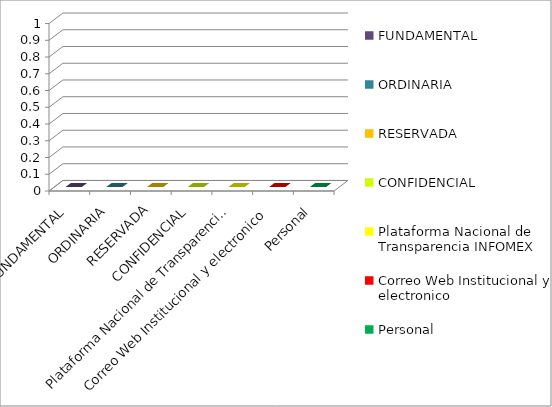
| Category | Series 2 |
|---|---|
| FUNDAMENTAL | 0 |
| ORDINARIA | 0 |
| RESERVADA | 0 |
| CONFIDENCIAL | 0 |
| Plataforma Nacional de Transparencia INFOMEX | 0 |
| Correo Web Institucional y electronico | 0 |
| Personal | 0 |